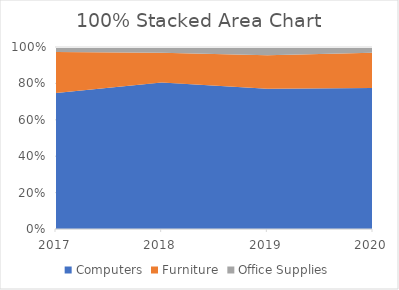
| Category | Computers | Furniture | Office Supplies |
|---|---|---|---|
| 2017.0 | 2000 | 600 | 75 |
| 2018.0 | 2200 | 450 | 85 |
| 2019.0 | 2100 | 500 | 125 |
| 2020.0 | 3000 | 750 | 123 |